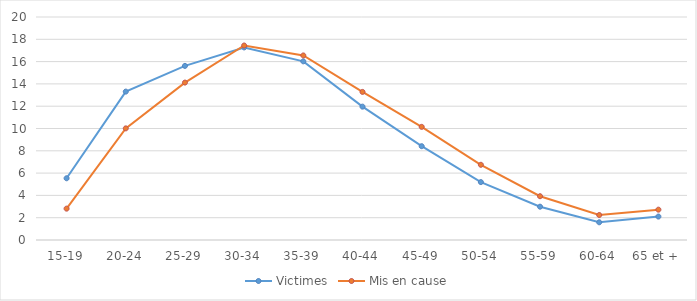
| Category | Victimes | Mis en cause |
|---|---|---|
| 15-19 | 5.537 | 2.813 |
| 20-24 | 13.309 | 10.012 |
| 25-29 | 15.614 | 14.117 |
| 30-34 | 17.271 | 17.443 |
| 35-39 | 16.024 | 16.552 |
| 40-44 | 11.96 | 13.282 |
| 45-49 | 8.413 | 10.148 |
| 50-54 | 5.194 | 6.746 |
| 55-59 | 2.987 | 3.927 |
| 60-64 | 1.589 | 2.24 |
| 65 et + | 2.102 | 2.721 |